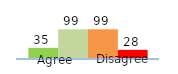
| Category | Series 0 | Series 1 | Series 2 | Series 3 |
|---|---|---|---|---|
| 0 | 35 | 99 | 99 | 28 |